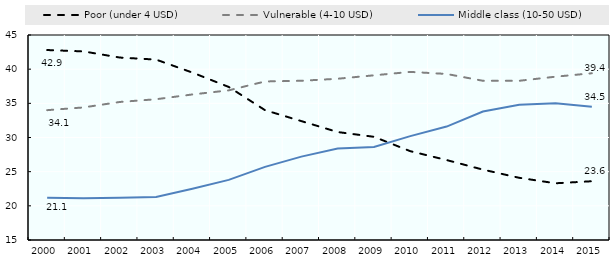
| Category | Poor (under 4 USD) | Vulnerable (4-10 USD) | Middle class (10-50 USD) |
|---|---|---|---|
| 2000.0 | 42.8 | 34 | 21.2 |
| 2001.0 | 42.6 | 34.4 | 21.1 |
| 2002.0 | 41.7 | 35.2 | 21.2 |
| 2003.0 | 41.4 | 35.6 | 21.3 |
| 2004.0 | 39.5 | 36.3 | 22.5 |
| 2005.0 | 37.4 | 36.9 | 23.8 |
| 2006.0 | 34 | 38.2 | 25.7 |
| 2007.0 | 32.4 | 38.3 | 27.2 |
| 2008.0 | 30.8 | 38.6 | 28.4 |
| 2009.0 | 30.1 | 39.1 | 28.6 |
| 2010.0 | 28 | 39.6 | 30.2 |
| 2011.0 | 26.7 | 39.3 | 31.6 |
| 2012.0 | 25.3 | 38.3 | 33.8 |
| 2013.0 | 24.1 | 38.3 | 34.8 |
| 2014.0 | 23.3 | 38.9 | 35 |
| 2015.0 | 23.6 | 39.4 | 34.5 |